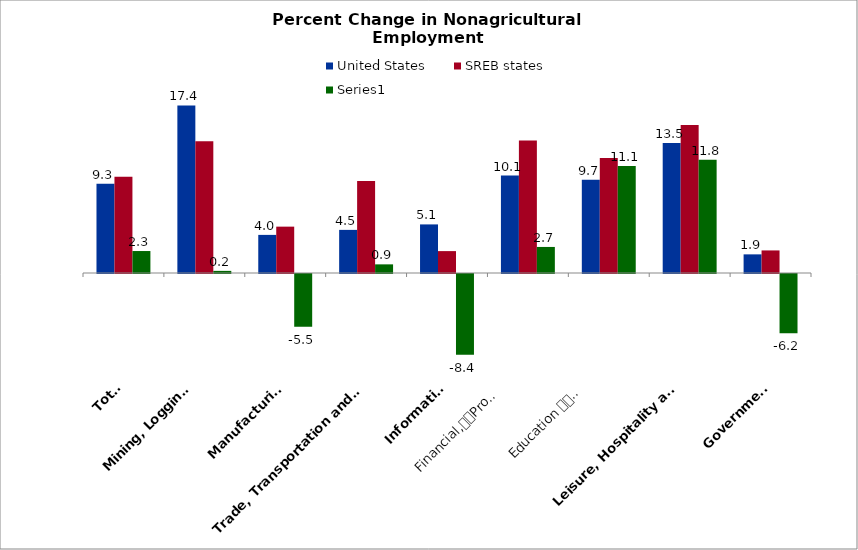
| Category | United States | SREB states | Series 0 |
|---|---|---|---|
| Total | 9.294 | 10.016 | 2.289 |
| Mining, Logging 
and Construction | 17.448 | 13.726 | 0.221 |
| Manufacturing | 3.97 | 4.829 | -5.485 |
| Trade, Transportation and Utilities | 4.491 | 9.581 | 0.9 |
| Information | 5.062 | 2.281 | -8.4 |
| Financial,
Professional and 
Business Services | 10.15 | 13.806 | 2.714 |
| Education 
and 
Health Services | 9.703 | 11.985 | 11.139 |
| Leisure, Hospitality and 
Other Services | 13.542 | 15.42 | 11.79 |
| Government | 1.942 | 2.351 | -6.166 |